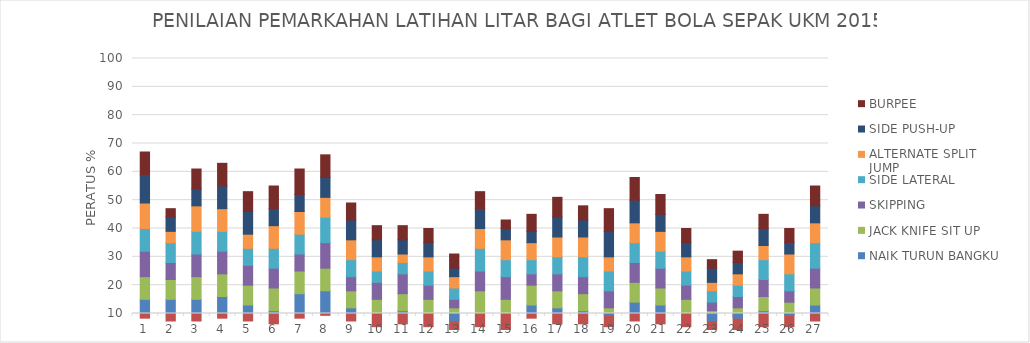
| Category | TEKAN TUBI | NAIK TURUN BANGKU | JACK KNIFE SIT UP | SKIPPING | SIDE LATERAL | ALTERNATE SPLIT JUMP | SIDE PUSH-UP | BURPEE |
|---|---|---|---|---|---|---|---|---|
| 0 | 8 | 7 | 8 | 9 | 8 | 9 | 10 | 8 |
| 1 | 7 | 8 | 7 | 6 | 7 | 4 | 5 | 3 |
| 2 | 7 | 8 | 8 | 8 | 8 | 9 | 6 | 7 |
| 3 | 8 | 8 | 8 | 8 | 7 | 8 | 8 | 8 |
| 4 | 7 | 6 | 7 | 7 | 6 | 5 | 8 | 7 |
| 5 | 6 | 5 | 8 | 7 | 7 | 8 | 6 | 8 |
| 6 | 8 | 9 | 8 | 6 | 7 | 8 | 6 | 9 |
| 7 | 9 | 9 | 8 | 9 | 9 | 7 | 7 | 8 |
| 8 | 7 | 5 | 6 | 5 | 6 | 7 | 7 | 6 |
| 9 | 5 | 5 | 5 | 6 | 4 | 5 | 6 | 5 |
| 10 | 6 | 5 | 6 | 7 | 4 | 3 | 5 | 5 |
| 11 | 5 | 5 | 5 | 5 | 5 | 5 | 5 | 5 |
| 12 | 4 | 3 | 5 | 3 | 4 | 4 | 3 | 5 |
| 13 | 5 | 5 | 8 | 7 | 8 | 7 | 7 | 6 |
| 14 | 4 | 6 | 5 | 8 | 6 | 7 | 4 | 3 |
| 15 | 8 | 5 | 7 | 4 | 5 | 6 | 4 | 6 |
| 16 | 6 | 6 | 6 | 6 | 6 | 7 | 7 | 7 |
| 17 | 6 | 5 | 6 | 6 | 7 | 7 | 6 | 5 |
| 18 | 5 | 4 | 3 | 6 | 7 | 5 | 9 | 8 |
| 19 | 7 | 7 | 7 | 7 | 7 | 7 | 8 | 8 |
| 20 | 6 | 7 | 6 | 7 | 6 | 7 | 6 | 7 |
| 21 | 5 | 5 | 5 | 5 | 5 | 5 | 5 | 5 |
| 22 | 4 | 3 | 4 | 3 | 4 | 3 | 5 | 3 |
| 23 | 4 | 4 | 4 | 4 | 4 | 4 | 4 | 4 |
| 24 | 5 | 6 | 5 | 6 | 7 | 5 | 6 | 5 |
| 25 | 5 | 4 | 5 | 4 | 6 | 7 | 4 | 5 |
| 26 | 7 | 6 | 6 | 7 | 9 | 7 | 6 | 7 |